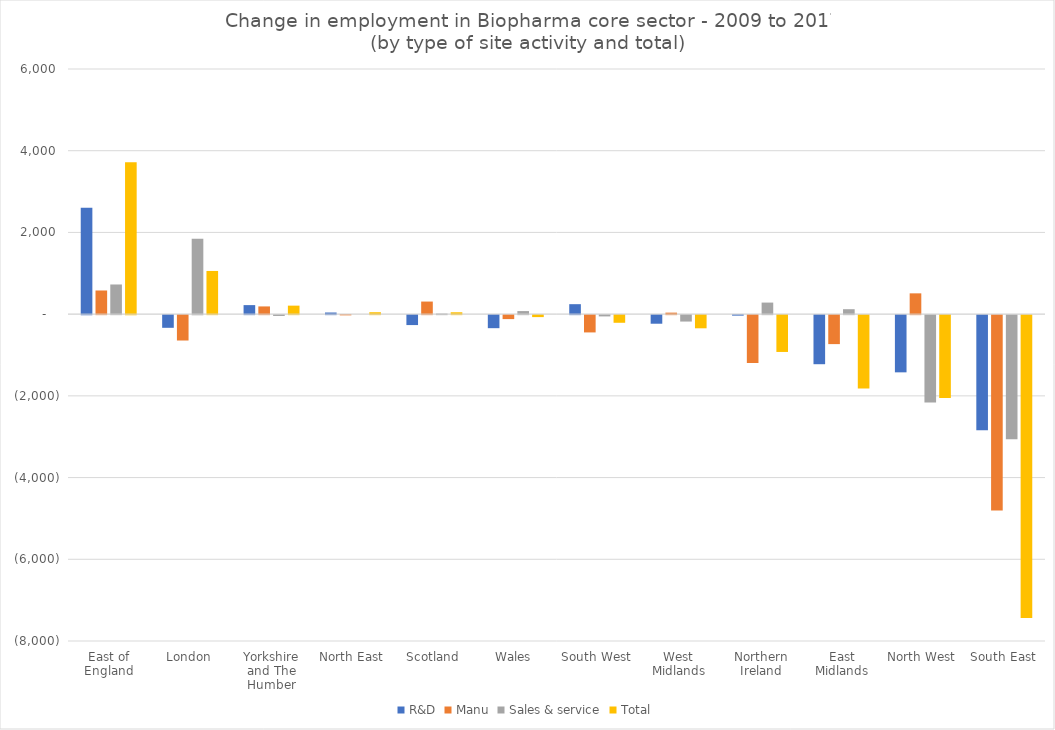
| Category | R&D | Manu | Sales & service | Total |
|---|---|---|---|---|
| East of England | 2607 | 579 | 726 | 3715 |
| London | -310 | -621 | 1846 | 1057 |
| Yorkshire and The Humber | 221 | 189 | -20 | 208 |
| North East | 40 | -5 | 0 | 47 |
| Scotland | -243 | 308 | 14 | 46 |
| Wales | -319 | -97 | 75 | -48 |
| South West | 244 | -423 | -31 | -187 |
| West Midlands | -210 | 37 | -157 | -322 |
| Northern Ireland | -12 | -1172 | 283 | -901 |
| East Midlands | -1201 | -709 | 121 | -1798 |
| North West | -1400 | 509 | -2138 | -2028 |
| South East | -2820 | -4779 | -3036 | -7414 |